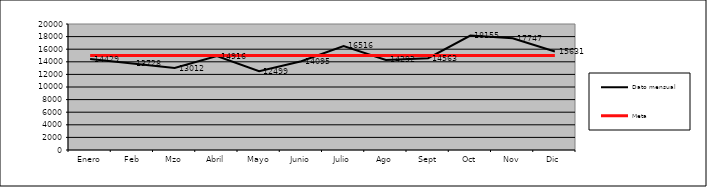
| Category | Dato mensual | Meta |
|---|---|---|
| Enero | 14429 | 15000 |
| Feb | 13728 | 15000 |
| Mzo | 13012 | 15000 |
| Abril | 14916 | 15000 |
| Mayo | 12499 | 15000 |
| Junio | 14095 | 15000 |
| Julio | 16516 | 15000 |
| Ago | 14292 | 15000 |
| Sept | 14563 | 15000 |
| Oct | 18155 | 15000 |
| Nov | 17747 | 15000 |
| Dic | 15631 | 15000 |